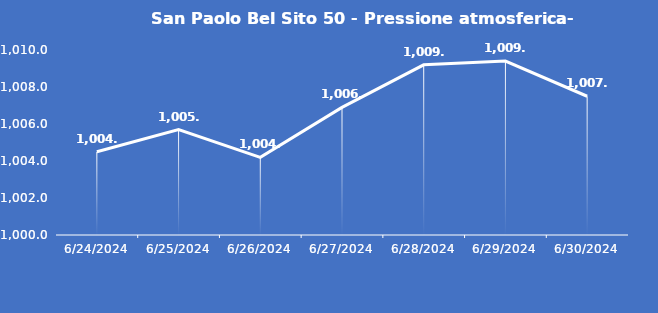
| Category | San Paolo Bel Sito 50 - Pressione atmosferica- Grezzo (hPa) |
|---|---|
| 6/24/24 | 1004.5 |
| 6/25/24 | 1005.7 |
| 6/26/24 | 1004.2 |
| 6/27/24 | 1006.9 |
| 6/28/24 | 1009.2 |
| 6/29/24 | 1009.4 |
| 6/30/24 | 1007.5 |